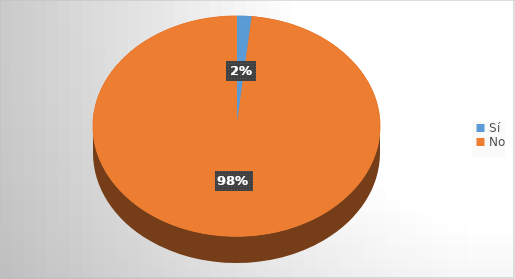
| Category | Series 0 |
|---|---|
| Sí | 2 |
| No | 117 |